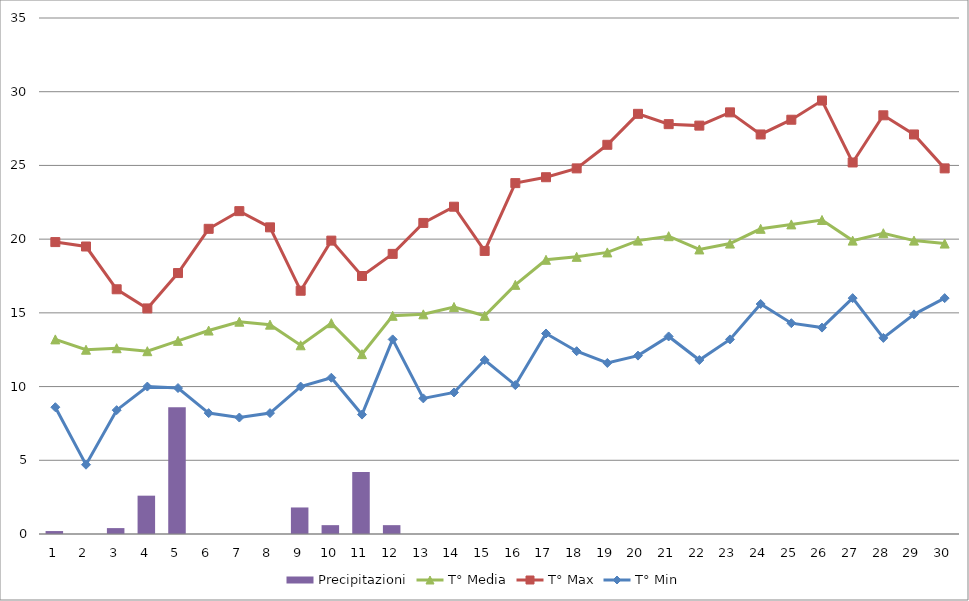
| Category | Precipitazioni |
|---|---|
| 0 | 0.2 |
| 1 | 0 |
| 2 | 0.4 |
| 3 | 2.6 |
| 4 | 8.6 |
| 5 | 0 |
| 6 | 0 |
| 7 | 0 |
| 8 | 1.8 |
| 9 | 0.6 |
| 10 | 4.2 |
| 11 | 0.6 |
| 12 | 0 |
| 13 | 0 |
| 14 | 0 |
| 15 | 0 |
| 16 | 0 |
| 17 | 0 |
| 18 | 0 |
| 19 | 0 |
| 20 | 0 |
| 21 | 0 |
| 22 | 0 |
| 23 | 0 |
| 24 | 0 |
| 25 | 0 |
| 26 | 0 |
| 27 | 0 |
| 28 | 0 |
| 29 | 0 |